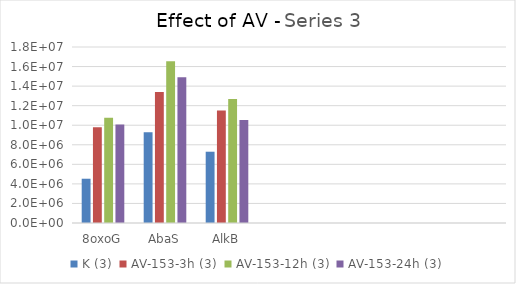
| Category | K (3) | AV-153-3h (3) | AV-153-12h (3) | AV-153-24h (3) |
|---|---|---|---|---|
| 8oxoG | 4527905.5 | 9783622.5 | 10775724.5 | 10073992 |
| AbaS | 9277951 | 13406051 | 16534902.5 | 14895549.5 |
| AlkB | 7290620 | 11496891.5 | 12669486 | 10538534.5 |